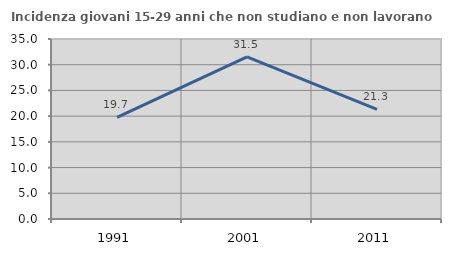
| Category | Incidenza giovani 15-29 anni che non studiano e non lavorano  |
|---|---|
| 1991.0 | 19.742 |
| 2001.0 | 31.507 |
| 2011.0 | 21.333 |